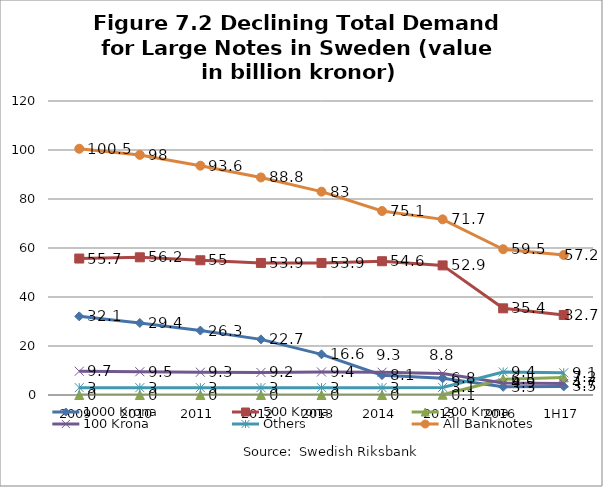
| Category | 1000 Krona | 500 Krona | 200 Krona | 100 Krona | Others | All Banknotes |
|---|---|---|---|---|---|---|
| 2009 | 32.1 | 55.7 | 0 | 9.7 | 3 | 100.5 |
| 2010 | 29.4 | 56.2 | 0 | 9.5 | 3 | 98 |
| 2011 | 26.3 | 55 | 0 | 9.3 | 3 | 93.6 |
| 2012 | 22.7 | 53.9 | 0 | 9.2 | 3 | 88.8 |
| 2013 | 16.6 | 53.9 | 0 | 9.4 | 3 | 83 |
| 2014 | 8.1 | 54.6 | 0 | 9.3 | 3 | 75.1 |
| 2015 | 6.8 | 52.9 | 0.1 | 8.8 | 3.1 | 71.7 |
| 2016 | 3.338 | 35.37 | 6.456 | 4.932 | 9.402 | 59.498 |
| 1H17 | 3.505 | 32.67 | 7.191 | 4.71 | 9.075 | 57.151 |